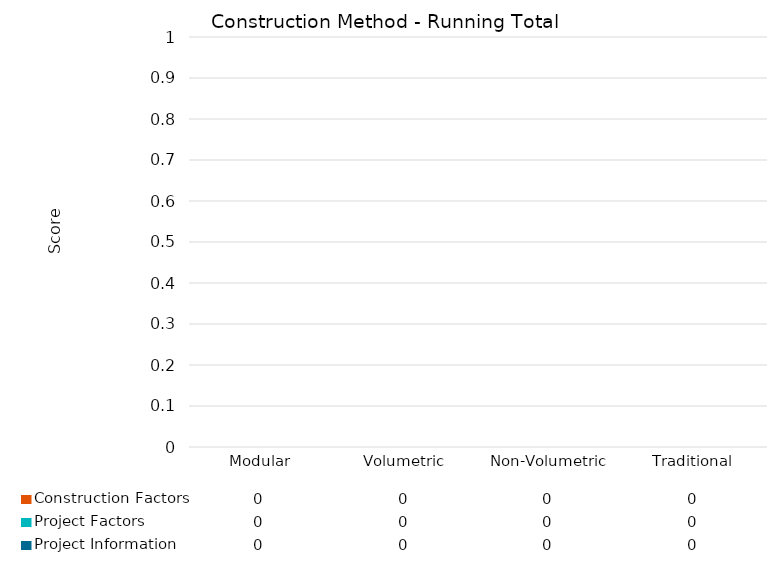
| Category | Project Information | Project Factors | Construction Factors |
|---|---|---|---|
| 0 | 0 | 0 | 0 |
| 1 | 0 | 0 | 0 |
| 2 | 0 | 0 | 0 |
| 3 | 0 | 0 | 0 |